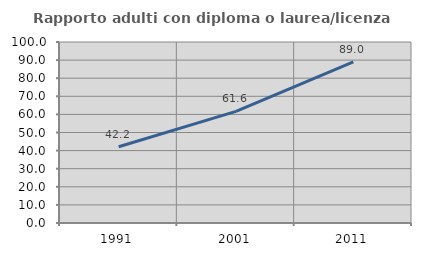
| Category | Rapporto adulti con diploma o laurea/licenza media  |
|---|---|
| 1991.0 | 42.152 |
| 2001.0 | 61.647 |
| 2011.0 | 89.046 |